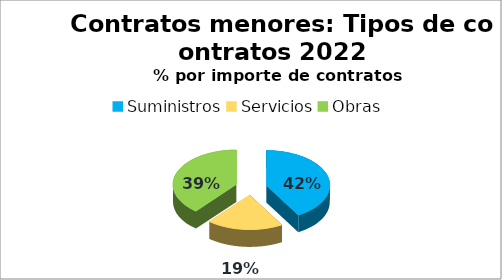
| Category | Series 0 |
|---|---|
| Suministros | 4628846.08 |
| Servicios | 2160102.34 |
| Obras | 4343069.35 |